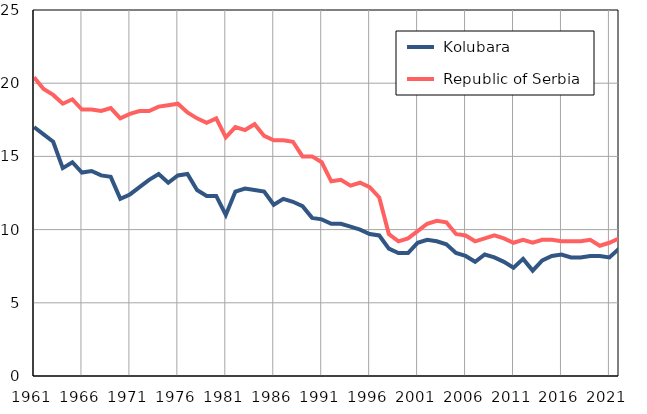
| Category |  Kolubara |  Republic of Serbia |
|---|---|---|
| 1961.0 | 17 | 20.4 |
| 1962.0 | 16.5 | 19.6 |
| 1963.0 | 16 | 19.2 |
| 1964.0 | 14.2 | 18.6 |
| 1965.0 | 14.6 | 18.9 |
| 1966.0 | 13.9 | 18.2 |
| 1967.0 | 14 | 18.2 |
| 1968.0 | 13.7 | 18.1 |
| 1969.0 | 13.6 | 18.3 |
| 1970.0 | 12.1 | 17.6 |
| 1971.0 | 12.4 | 17.9 |
| 1972.0 | 12.9 | 18.1 |
| 1973.0 | 13.4 | 18.1 |
| 1974.0 | 13.8 | 18.4 |
| 1975.0 | 13.2 | 18.5 |
| 1976.0 | 13.7 | 18.6 |
| 1977.0 | 13.8 | 18 |
| 1978.0 | 12.7 | 17.6 |
| 1979.0 | 12.3 | 17.3 |
| 1980.0 | 12.3 | 17.6 |
| 1981.0 | 11 | 16.3 |
| 1982.0 | 12.6 | 17 |
| 1983.0 | 12.8 | 16.8 |
| 1984.0 | 12.7 | 17.2 |
| 1985.0 | 12.6 | 16.4 |
| 1986.0 | 11.7 | 16.1 |
| 1987.0 | 12.1 | 16.1 |
| 1988.0 | 11.9 | 16 |
| 1989.0 | 11.6 | 15 |
| 1990.0 | 10.8 | 15 |
| 1991.0 | 10.7 | 14.6 |
| 1992.0 | 10.4 | 13.3 |
| 1993.0 | 10.4 | 13.4 |
| 1994.0 | 10.2 | 13 |
| 1995.0 | 10 | 13.2 |
| 1996.0 | 9.7 | 12.9 |
| 1997.0 | 9.6 | 12.2 |
| 1998.0 | 8.7 | 9.7 |
| 1999.0 | 8.4 | 9.2 |
| 2000.0 | 8.4 | 9.4 |
| 2001.0 | 9.1 | 9.9 |
| 2002.0 | 9.3 | 10.4 |
| 2003.0 | 9.2 | 10.6 |
| 2004.0 | 9 | 10.5 |
| 2005.0 | 8.4 | 9.7 |
| 2006.0 | 8.2 | 9.6 |
| 2007.0 | 7.8 | 9.2 |
| 2008.0 | 8.3 | 9.4 |
| 2009.0 | 8.1 | 9.6 |
| 2010.0 | 7.8 | 9.4 |
| 2011.0 | 7.4 | 9.1 |
| 2012.0 | 8 | 9.3 |
| 2013.0 | 7.2 | 9.1 |
| 2014.0 | 7.9 | 9.3 |
| 2015.0 | 8.2 | 9.3 |
| 2016.0 | 8.3 | 9.2 |
| 2017.0 | 8.1 | 9.2 |
| 2018.0 | 8.1 | 9.2 |
| 2019.0 | 8.2 | 9.3 |
| 2020.0 | 8.2 | 8.9 |
| 2021.0 | 8.1 | 9.1 |
| 2022.0 | 8.7 | 9.4 |